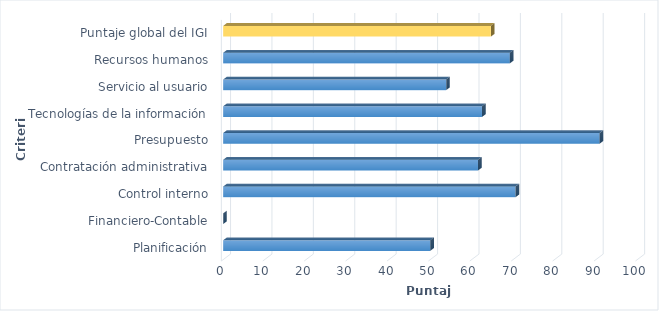
| Category | 2019 |
|---|---|
| Planificación | 50 |
| Financiero-Contable | 0 |
| Control interno | 70.588 |
| Contratación administrativa | 61.538 |
| Presupuesto | 90.91 |
| Tecnologías de la información | 62.5 |
| Servicio al usuario | 53.846 |
| Recursos humanos | 69.23 |
| Puntaje global del IGI | 64.65 |